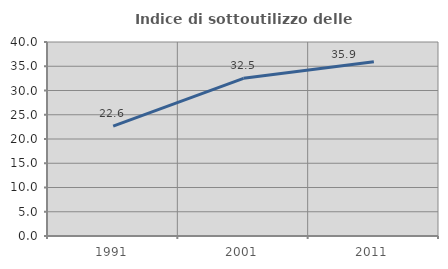
| Category | Indice di sottoutilizzo delle abitazioni  |
|---|---|
| 1991.0 | 22.636 |
| 2001.0 | 32.505 |
| 2011.0 | 35.943 |